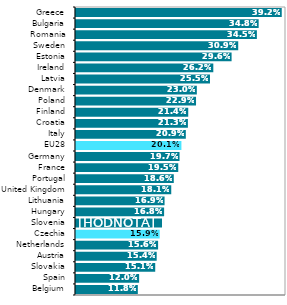
| Category | Series 0 |
|---|---|
| Belgium | 0.118 |
| Spain | 0.12 |
| Slovakia | 0.151 |
| Austria | 0.154 |
| Netherlands | 0.156 |
| Czechia | 0.159 |
| Slovenia | 0.164 |
| Hungary | 0.168 |
| Lithuania | 0.169 |
| United Kingdom | 0.181 |
| Portugal | 0.186 |
| France | 0.195 |
| Germany | 0.197 |
| EU28 | 0.201 |
| Italy | 0.209 |
| Croatia | 0.213 |
| Finland | 0.214 |
| Poland | 0.229 |
| Denmark | 0.23 |
| Latvia | 0.255 |
| Ireland | 0.262 |
| Estonia | 0.296 |
| Sweden | 0.309 |
| Romania | 0.345 |
| Bulgaria | 0.348 |
| Greece | 0.392 |